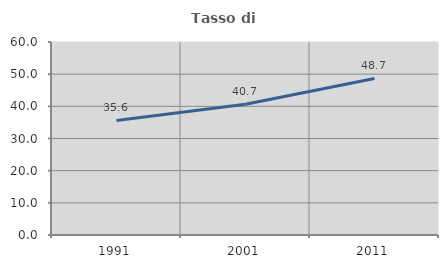
| Category | Tasso di occupazione   |
|---|---|
| 1991.0 | 35.602 |
| 2001.0 | 40.674 |
| 2011.0 | 48.67 |